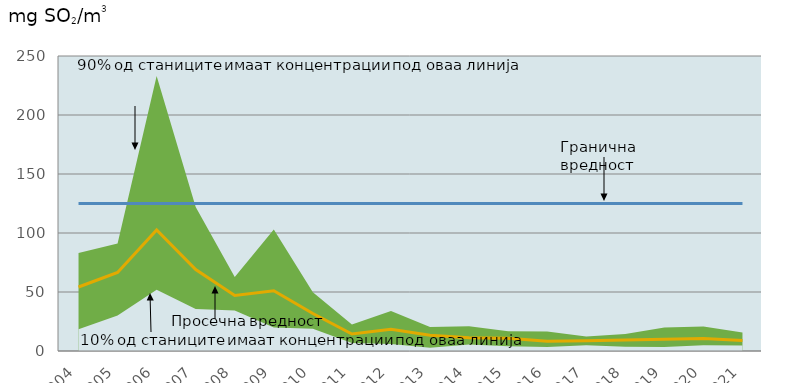
| Category | LV | average |
|---|---|---|
| 2004.0 | 125 | 54.25 |
| 2005.0 | 125 | 66.583 |
| 2006.0 | 125 | 102.636 |
| 2007.0 | 125 | 69.077 |
| 2008.0 | 125 | 47.083 |
| 2009.0 | 125 | 51.091 |
| 2010.0 | 125 | 31.778 |
| 2011.0 | 125 | 14.375 |
| 2012.0 | 125 | 18.429 |
| 2013.0 | 125 | 13.333 |
| 2014.0 | 125 | 11.155 |
| 2015.0 | 125 | 10.788 |
| 2016.0 | 125 | 8.335 |
| 2017.0 | 125 | 8.751 |
| 2018.0 | 125 | 9.252 |
| 2019.0 | 125 | 9.905 |
| 2020.0 | 125 | 10.653 |
| 2021.0 | 125 | 8.97 |